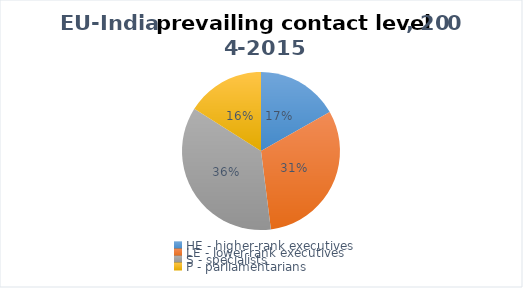
| Category | 2004-2015 |
|---|---|
| HE - higher-rank executives | 21 |
| LE - lower-rank executives | 39 |
| S - specialists | 45 |
| P - parliamentarians | 20 |